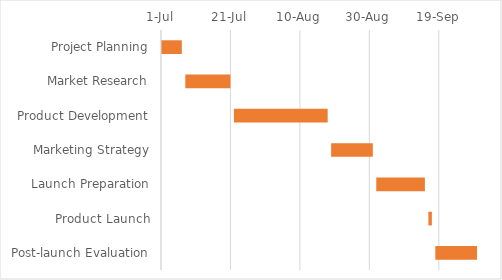
| Category | Start Date | Duration |
|---|---|---|
| Project Planning | 2023-07-01 | 6 |
| Market Research | 2023-07-08 | 13 |
| Product Development | 2023-07-22 | 27 |
| Marketing Strategy | 2023-08-19 | 12 |
| Launch Preparation | 2023-09-01 | 14 |
| Product Launch | 2023-09-16 | 1 |
| Post-launch Evaluation | 2023-09-18 | 12 |